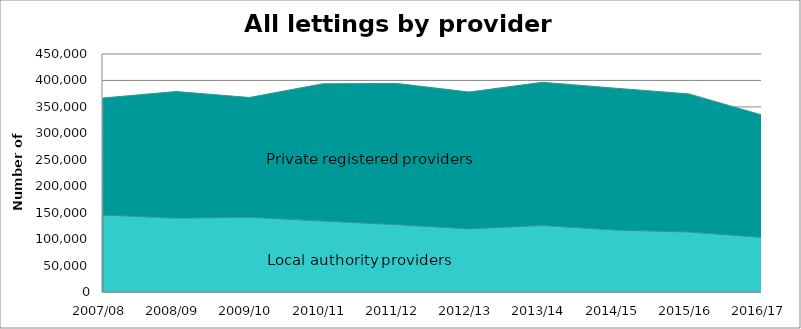
| Category | Series 1 | Series 0 |
|---|---|---|
| 0 | 145403 | 221417 |
| 1 | 139528 | 239554 |
| 2 | 141169 | 226586 |
| 3 | 134063 | 259562 |
| 4 | 127278 | 267206 |
| 5 | 119312 | 258731 |
| 6 | 125812 | 270659 |
| 7 | 117070 | 268273 |
| 8 | 113423.3 | 261163 |
| 9 | 103122.035 | 231480 |